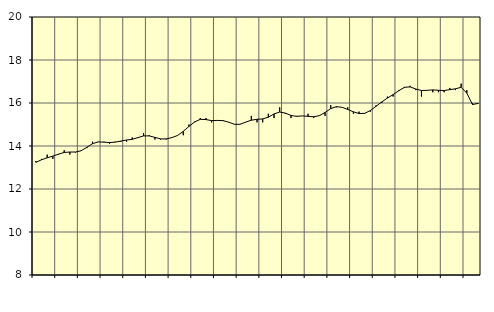
| Category | Piggar | Vård och omsorg, SNI 86-88 |
|---|---|---|
| nan | 13.3 | 13.24 |
| 1.0 | 13.4 | 13.36 |
| 1.0 | 13.6 | 13.45 |
| 1.0 | 13.4 | 13.53 |
| nan | 13.6 | 13.62 |
| 2.0 | 13.8 | 13.7 |
| 2.0 | 13.6 | 13.72 |
| 2.0 | 13.7 | 13.72 |
| nan | 13.8 | 13.78 |
| 3.0 | 13.9 | 13.94 |
| 3.0 | 14.2 | 14.11 |
| 3.0 | 14.2 | 14.19 |
| nan | 14.2 | 14.18 |
| 4.0 | 14.1 | 14.16 |
| 4.0 | 14.2 | 14.18 |
| 4.0 | 14.2 | 14.23 |
| nan | 14.2 | 14.28 |
| 5.0 | 14.4 | 14.31 |
| 5.0 | 14.4 | 14.39 |
| 5.0 | 14.6 | 14.47 |
| nan | 14.5 | 14.47 |
| 6.0 | 14.3 | 14.4 |
| 6.0 | 14.3 | 14.33 |
| 6.0 | 14.3 | 14.33 |
| nan | 14.4 | 14.39 |
| 7.0 | 14.5 | 14.49 |
| 7.0 | 14.5 | 14.68 |
| 7.0 | 15 | 14.91 |
| nan | 15.1 | 15.12 |
| 8.0 | 15.3 | 15.24 |
| 8.0 | 15.3 | 15.23 |
| 8.0 | 15.1 | 15.18 |
| nan | 15.2 | 15.19 |
| 9.0 | 15.2 | 15.18 |
| 9.0 | 15.1 | 15.11 |
| 9.0 | 15 | 15.01 |
| nan | 15 | 15.01 |
| 10.0 | 15.1 | 15.11 |
| 10.0 | 15.4 | 15.2 |
| 10.0 | 15.1 | 15.24 |
| nan | 15.1 | 15.26 |
| 11.0 | 15.5 | 15.34 |
| 11.0 | 15.3 | 15.49 |
| 11.0 | 15.8 | 15.58 |
| nan | 15.5 | 15.53 |
| 12.0 | 15.3 | 15.42 |
| 12.0 | 15.4 | 15.38 |
| 12.0 | 15.4 | 15.4 |
| nan | 15.5 | 15.38 |
| 13.0 | 15.3 | 15.36 |
| 13.0 | 15.4 | 15.41 |
| 13.0 | 15.4 | 15.56 |
| nan | 15.9 | 15.74 |
| 14.0 | 15.8 | 15.83 |
| 14.0 | 15.8 | 15.8 |
| 14.0 | 15.8 | 15.7 |
| nan | 15.5 | 15.59 |
| 15.0 | 15.6 | 15.51 |
| 15.0 | 15.5 | 15.52 |
| 15.0 | 15.6 | 15.65 |
| nan | 15.9 | 15.85 |
| 16.0 | 16 | 16.05 |
| 16.0 | 16.3 | 16.23 |
| 16.0 | 16.3 | 16.39 |
| nan | 16.6 | 16.57 |
| 17.0 | 16.7 | 16.73 |
| 17.0 | 16.8 | 16.75 |
| 17.0 | 16.6 | 16.65 |
| nan | 16.3 | 16.58 |
| 18.0 | 16.6 | 16.59 |
| 18.0 | 16.5 | 16.61 |
| 18.0 | 16.5 | 16.59 |
| nan | 16.5 | 16.58 |
| 19.0 | 16.7 | 16.62 |
| 19.0 | 16.6 | 16.66 |
| 19.0 | 16.9 | 16.73 |
| nan | 16.6 | 16.46 |
| 20.0 | 16 | 15.93 |
| 20.0 | 16 | 15.98 |